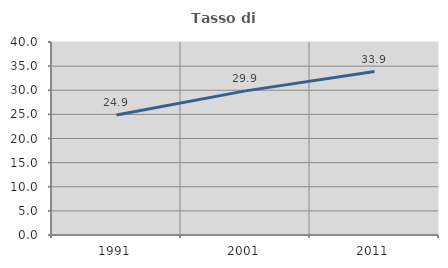
| Category | Tasso di occupazione   |
|---|---|
| 1991.0 | 24.867 |
| 2001.0 | 29.868 |
| 2011.0 | 33.868 |